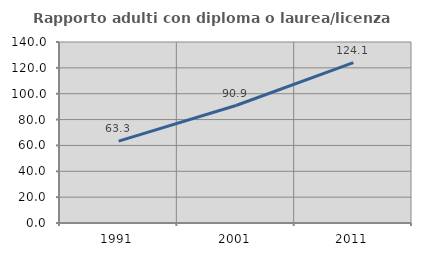
| Category | Rapporto adulti con diploma o laurea/licenza media  |
|---|---|
| 1991.0 | 63.287 |
| 2001.0 | 90.866 |
| 2011.0 | 124.102 |